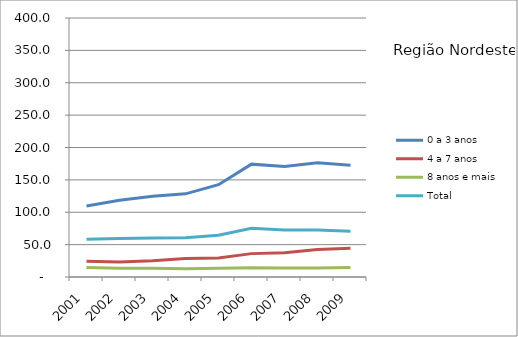
| Category | 0 a 3 anos | 4 a 7 anos | 8 anos e mais | Total |
|---|---|---|---|---|
| 2001.0 | 109.7 | 24.3 | 14.8 | 58.3 |
| 2002.0 | 118.4 | 23.3 | 13.5 | 59.3 |
| 2003.0 | 124.8 | 25.1 | 13.5 | 60.2 |
| 2004.0 | 128.4 | 28.6 | 12.8 | 60.5 |
| 2005.0 | 142.6 | 29.3 | 13.6 | 64.6 |
| 2006.0 | 174.3 | 36.1 | 14.4 | 75.3 |
| 2007.0 | 170.6 | 37.6 | 13.9 | 72.5 |
| 2008.0 | 176.3 | 42.3 | 13.8 | 72.4 |
| 2009.0 | 172.6 | 44.3 | 14.5 | 70.7 |